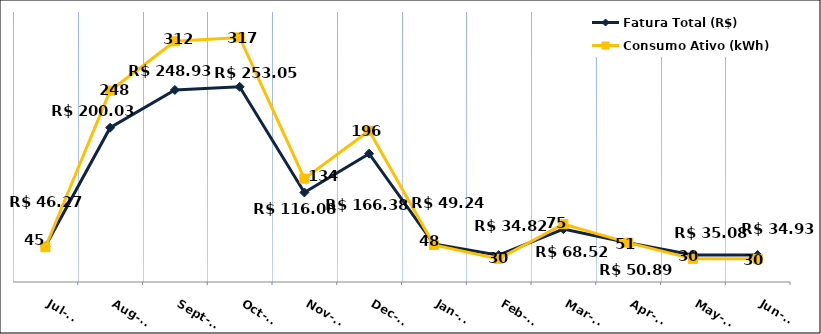
| Category | Fatura Total (R$) |
|---|---|
| 2023-07-01 | 46.27 |
| 2023-08-01 | 200.03 |
| 2023-09-01 | 248.93 |
| 2023-10-01 | 253.05 |
| 2023-11-01 | 116.08 |
| 2023-12-01 | 166.38 |
| 2024-01-01 | 49.24 |
| 2024-02-01 | 34.82 |
| 2024-03-01 | 68.52 |
| 2024-04-01 | 50.89 |
| 2024-05-01 | 35.08 |
| 2024-06-01 | 34.93 |